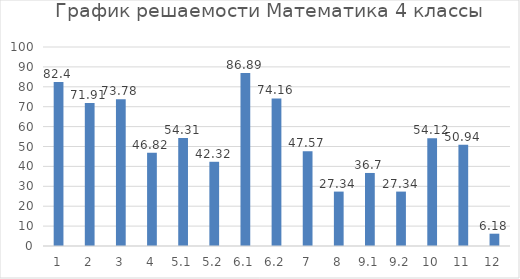
| Category | Series 0 |
|---|---|
| 1.0 | 82.4 |
| 2.0 | 71.91 |
| 3.0 | 73.78 |
| 4.0 | 46.82 |
| 5.1 | 54.31 |
| 5.2 | 42.32 |
| 6.1 | 86.89 |
| 6.2 | 74.16 |
| 7.0 | 47.57 |
| 8.0 | 27.34 |
| 9.1 | 36.7 |
| 9.2 | 27.34 |
| 10.0 | 54.12 |
| 11.0 | 50.94 |
| 12.0 | 6.18 |